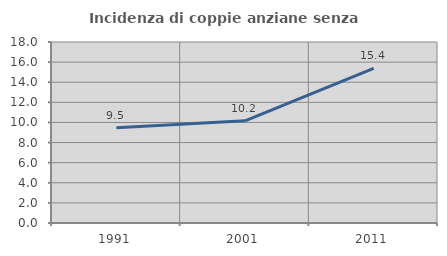
| Category | Incidenza di coppie anziane senza figli  |
|---|---|
| 1991.0 | 9.467 |
| 2001.0 | 10.165 |
| 2011.0 | 15.377 |